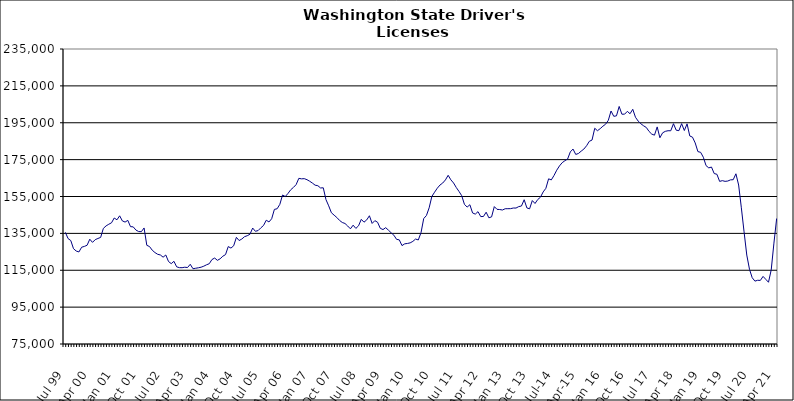
| Category | Series 0 |
|---|---|
| Jul 99 | 135560 |
| Aug 99 | 132182 |
| Sep 99 | 131104 |
| Oct 99 | 126694 |
| Nov 99 | 125425 |
| Dec 99 | 124927 |
| Jan 00 | 127499 |
| Feb 00 | 127927 |
| Mar 00 | 128547 |
| Apr 00 | 131834 |
| May 00 | 130120 |
| Jun 00 | 131595 |
| Jul 00 | 132236 |
| Aug 00 | 132819 |
| Sep 00 | 137711 |
| Oct 00 | 139063 |
| Nov 00 | 139952 |
| Dec 00 | 140732 |
| Jan 01 | 143338 |
| Feb 01 | 142359 |
| Mar 01 | 144523 |
| Apr 01 | 141758 |
| May 01 | 141135 |
| Jun 01 | 142064 |
| Jul 01 | 138646 |
| Aug 01 | 138530 |
| Sep 01 | 136784 |
| Oct 01 | 135996 |
| Nov 01 | 135917 |
| Dec 01 | 137940 |
| Jan 02 | 128531 |
| Feb 02 | 127848 |
| Mar 02 | 125876 |
| Apr 02 | 124595 |
| May 02 | 123660 |
| Jun 02 | 123282 |
| Jul 02 | 122089 |
| Aug 02 | 123279 |
| Sep 02 | 119727 |
| Oct 02 | 118588 |
| Nov 02 | 119854 |
| Dec 02 | 116851 |
| Jan 03 | 116407 |
| Feb 03 | 116382 |
| Mar 03 | 116648 |
| Apr 03 | 116471 |
| May 03 | 118231 |
| Jun 03 | 115831 |
| Jul 03 | 116082 |
| Aug 03 | 116341 |
| Sep 03 | 116653 |
| Oct 03 | 117212 |
| Nov 03 | 117962 |
| Dec 03 | 118542 |
| Jan 04 | 120817 |
| Feb 04 | 121617 |
| Mar 04 | 120369 |
| Apr 04 | 121200 |
| May 04 | 122609 |
| Jun 04 | 123484 |
| Jul 04 | 127844 |
| Aug 04 | 127025 |
| Sep 04 | 128273 |
| Oct 04 | 132853 |
| Nov 04 | 131106 |
| Dec 04 | 131935 |
| Jan 05 | 133205 |
| Feb 05 | 133736 |
| Mar 05 | 134528 |
| Apr 05 | 137889 |
| May 05 | 136130 |
| Jun 05 | 136523 |
| Jul 05 | 137997 |
| Aug 05 | 139294 |
| Sep 05 | 142140 |
| Oct 05 | 141192 |
| Nov 05 | 142937 |
| Dec 05 | 148013 |
| Jan 06 | 148341 |
| Feb 06 | 150744 |
| Mar 06 | 155794 |
| Apr 06 | 154984 |
| May 06 | 156651 |
| Jun 06 | 158638 |
| Jul 06 | 159911 |
| Aug 06 | 161445 |
| Sep 06 | 164852 |
| Oct 06 | 164570 |
| Nov 06 | 164679 |
| Dec 06 | 164127 |
| Jan 07 | 163271 |
| Feb 07 | 162273 |
| Mar 07 | 161140 |
| Apr 07 | 160860 |
| May 07 | 159633 |
| Jun 07 | 159724 |
| Jul 07 | 153303 |
| Aug 07 | 149939 |
| Sep 07 | 146172 |
| Oct 07 | 144876 |
| Nov 07 | 143613 |
| Dec 07 | 142022 |
| Jan 08 | 140909 |
| Feb 08 | 140368 |
| Mar 08 | 138998 |
| Apr 08 | 137471 |
| May 08 | 139453 |
| Jun 08 | 137680 |
| Jul 08 | 139120 |
| Aug 08 | 142612 |
| Sep-08 | 141071 |
| Oct 08 | 142313 |
| Nov 08 | 144556 |
| Dec 08 | 140394 |
| Jan 09 | 141903 |
| Feb 09 | 141036 |
| Mar 09 | 137751 |
| Apr 09 | 137060 |
| May 09 | 138101 |
| Jun 09 | 136739 |
| Jul 09 | 135317 |
| Aug 09 | 134020 |
| Sep 09 | 131756 |
| Oct 09 | 131488 |
| Nov 09 | 128370 |
| Dec 09 | 129323 |
| Jan 10 | 129531 |
| Feb 10 | 129848 |
| Mar 10 | 130654 |
| Apr 10 | 131929 |
| May 10 | 131429 |
| Jun 10 | 135357 |
| Jul 10 | 143032 |
| Aug 10 | 144686 |
| Sep 10 | 148856 |
| Oct 10 | 155042 |
| Nov 10 | 157328 |
| Dec 10 | 159501 |
| Jan 11 | 161221 |
| Feb 11 | 162312 |
| Mar 11 | 163996 |
| Apr 11 | 166495 |
| May 11 | 164040 |
| Jun 11 | 162324 |
| Jul 11 | 159862 |
| Aug 11 | 157738 |
| Sep 11 | 155430 |
| Oct 11 | 150762 |
| Nov 11 | 149255 |
| Dec 11 | 150533 |
| Jan 12 | 146068 |
| Feb 12 | 145446 |
| Mar 12 | 146788 |
| Apr 12 | 144110 |
| May 12 | 144162 |
| Jun 12 | 146482 |
| Jul 12 | 143445 |
| Aug 12 | 143950 |
| Sep 12 | 149520 |
| Oct 12 | 148033 |
| Nov 12 | 147926 |
| Dec 12 | 147674 |
| Jan 13 | 148360 |
| Feb-13 | 148388 |
| Mar-13 | 148414 |
| Apr 13 | 148749 |
| May 13 | 148735 |
| Jun-13 | 149521 |
| Jul 13 | 149837 |
| Aug 13 | 153252 |
| Sep 13 | 148803 |
| Oct 13 | 148315 |
| Nov 13 | 152804 |
| Dec 13 | 151209 |
| Jan 14 | 153357 |
| Feb-14 | 154608 |
| Mar 14 | 157479 |
| Apr 14 | 159441 |
| May 14 | 164591 |
| Jun 14 | 163995 |
| Jul-14 | 166411 |
| Aug-14 | 169272 |
| Sep 14 | 171565 |
| Oct 14 | 173335 |
| Nov 14 | 174406 |
| Dec 14 | 175302 |
| Jan 15 | 179204 |
| Feb 15 | 180737 |
| Mar 15 | 177810 |
| Apr-15 | 178331 |
| May 15 | 179601 |
| Jun-15 | 180729 |
| Jul 15 | 182540 |
| Aug 15 | 184924 |
| Sep 15 | 185620 |
| Oct 15 | 192002 |
| Nov 15 | 190681 |
| Dec 15 | 191795 |
| Jan 16 | 193132 |
| Feb 16 | 194206 |
| Mar 16 | 196319 |
| Apr 16 | 201373 |
| May 16 | 198500 |
| Jun 16 | 198743 |
| Jul 16 | 203841 |
| Aug 16 | 199630 |
| Sep 16 | 199655 |
| Oct 16 | 201181 |
| Nov 16 | 199888 |
| Dec 16 | 202304 |
| Jan 17 | 197977 |
| Feb 17 | 195889 |
| Mar 17 | 194438 |
| Apr 17 | 193335 |
| May 17 | 192430 |
| Jun 17 | 190298 |
| Jul 17 | 188832 |
| Aug 17 | 188264 |
| Sep 17 | 192738 |
| Oct 17 | 186856 |
| Nov 17 | 189537 |
| Dec 17 | 190341 |
| Jan 18 | 190670 |
| Feb 18 | 190645 |
| Mar 18 | 194476 |
| Apr 18 | 190971 |
| May 18 | 190707 |
| Jun 18 | 194516 |
| Jul 18 | 190783 |
| Aug 18 | 194390 |
| Sep 18 | 187831 |
| Oct 18 | 187188 |
| Nov 18 | 184054 |
| Dec 18 | 179347 |
| Jan 19 | 178958 |
| Feb 19 | 176289 |
| Mar 19 | 171747 |
| Apr 19 | 170532 |
| May 19 | 170967 |
| Jun 19 | 167444 |
| Jul 19 | 167059 |
| Aug 19 | 163194 |
| Sep 19 | 163599 |
| Oct 19 | 163212 |
| Nov 19 | 163388 |
| Dec 19 | 164024 |
| Jan 20 | 164114 |
| Feb 20 | 167320 |
| Mar 20 | 161221 |
| Apr 20 | 148866 |
| May 20 | 135821 |
| Jun 20 | 123252 |
| Jul 20 | 115526 |
| Aug 20 | 110940 |
| Sep 20 | 109099 |
| Oct 20 | 109566 |
| Nov 20 | 109488 |
| Dec 20 | 111658 |
| Jan 21 | 110070 |
| Feb 21 | 108491 |
| Mar 21 | 115176 |
| Apr 21 | 129726 |
| May 21 | 143052 |